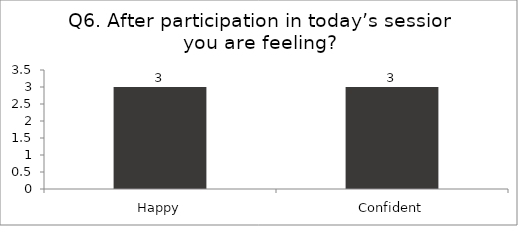
| Category | Q6. After participation in today’s session you are feeling? |
|---|---|
| Happy | 3 |
| Confident | 3 |